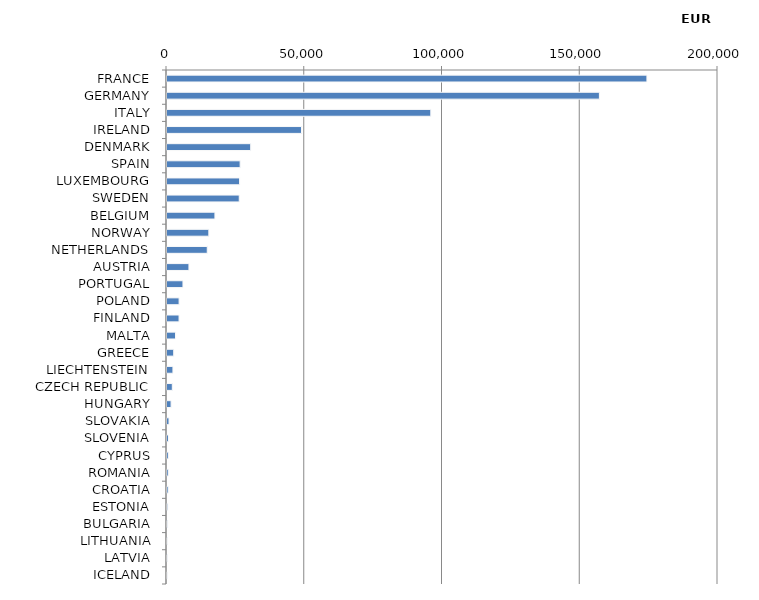
| Category | Series 0 |
|---|---|
| FRANCE | 174200.86 |
| GERMANY | 156950.82 |
| ITALY | 95754.13 |
| IRELAND | 48828.86 |
| DENMARK | 30379.93 |
| SPAIN | 26550.79 |
| LUXEMBOURG | 26347.93 |
| SWEDEN | 26220.53 |
| BELGIUM | 17396.23 |
| NORWAY | 15183.69 |
| NETHERLANDS | 14611.68 |
| AUSTRIA | 7965.65 |
| PORTUGAL | 5793.81 |
| POLAND | 4393.45 |
| FINLAND | 4377.87 |
| MALTA | 3101.47 |
| GREECE | 2435.9 |
| LIECHTENSTEIN | 2155.23 |
| CZECH REPUBLIC | 1926.26 |
| HUNGARY | 1484.14 |
| SLOVAKIA | 738.67 |
| SLOVENIA | 543.85 |
| CYPRUS | 502.92 |
| ROMANIA | 470.63 |
| CROATIA | 421.08 |
| ESTONIA | 282.31 |
| BULGARIA | 231.38 |
| LITHUANIA | 157.96 |
| LATVIA | 106.94 |
| ICELAND | 51.85 |